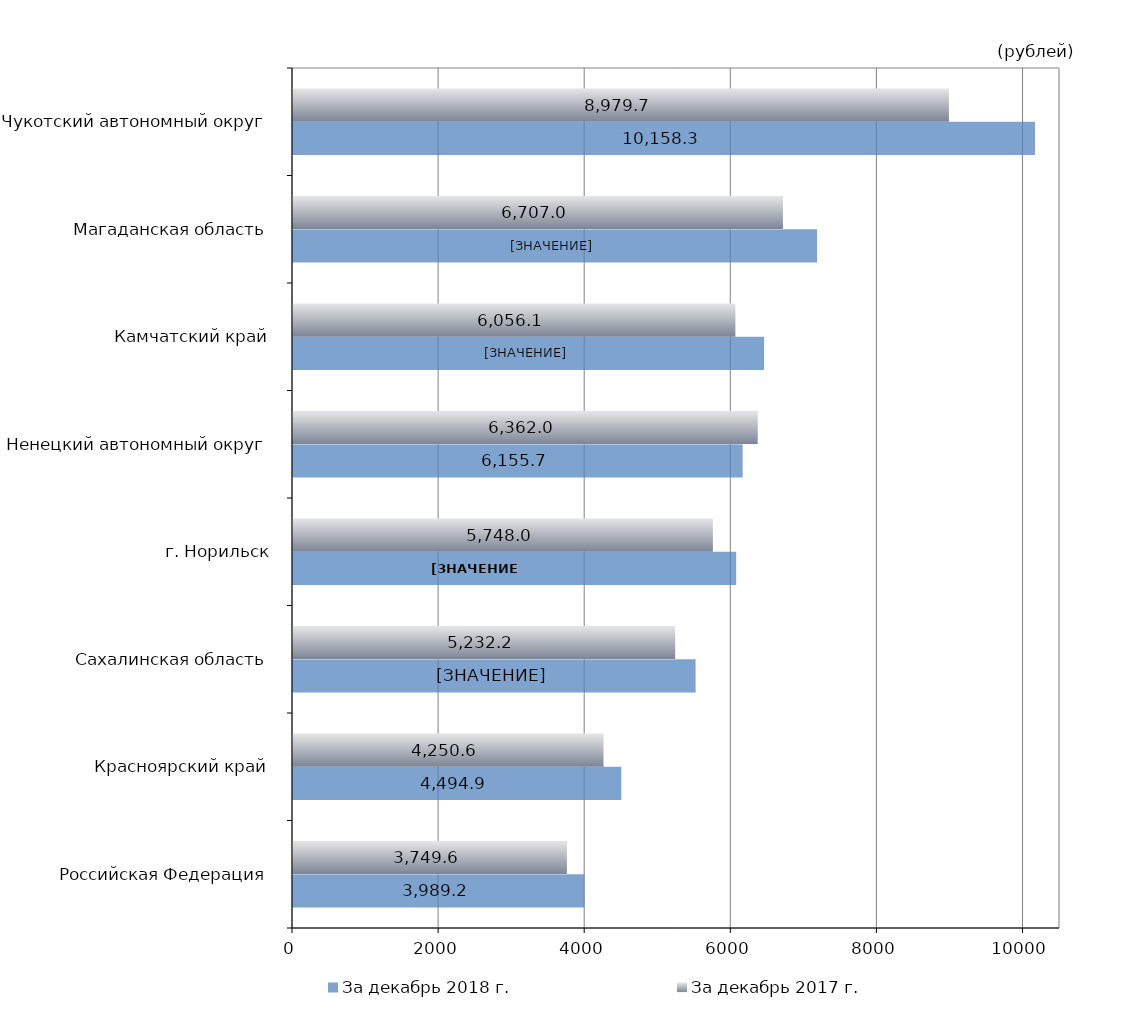
| Category | За декабрь 2018 г. | За декабрь 2017 г. |
|---|---|---|
| Российская Федерация | 3989.17 | 3749.64 |
| Красноярский край | 4494.94 | 4250.62 |
| Сахалинская область | 5511.57 | 5232.2 |
| г. Норильск | 6066.66 | 5748.02 |
| Ненецкий автономный округ | 6155.72 | 6362.01 |
| Камчатский край | 6449.55 | 6056.07 |
| Магаданская область | 7174.79 | 6707 |
| Чукотский автономный округ | 10158.25 | 8979.68 |